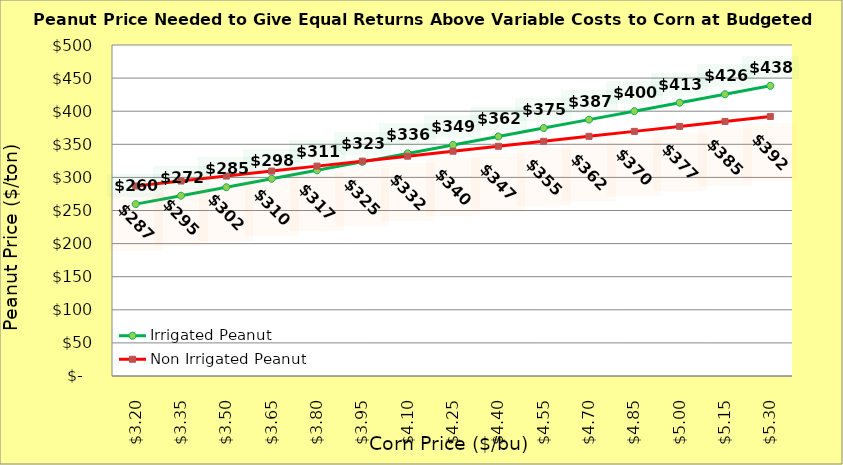
| Category | Irrigated Peanut | Non Irrigated Peanut |
|---|---|---|
| 3.2 | 259.626 | 287.02 |
| 3.35 | 272.392 | 294.52 |
| 3.5 | 285.158 | 302.02 |
| 3.65 | 297.924 | 309.52 |
| 3.8 | 310.69 | 317.02 |
| 3.9499999999999997 | 323.456 | 324.52 |
| 4.1 | 336.222 | 332.02 |
| 4.25 | 348.988 | 339.52 |
| 4.4 | 361.754 | 347.02 |
| 4.550000000000001 | 374.52 | 354.52 |
| 4.700000000000001 | 387.286 | 362.02 |
| 4.850000000000001 | 400.052 | 369.52 |
| 5.000000000000002 | 412.818 | 377.02 |
| 5.150000000000002 | 425.584 | 384.52 |
| 5.3000000000000025 | 438.35 | 392.02 |